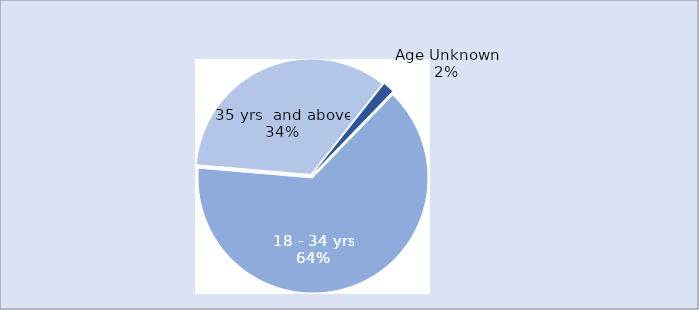
| Category | Series 0 |
|---|---|
| 18 - 34 yrs | 1690 |
| 35 yrs  and above | 904 |
| Age Unknown | 41 |